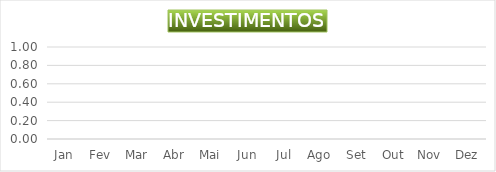
| Category | INVESTIMENTOS |
|---|---|
| Jan | 0 |
| Fev | 0 |
| Mar | 0 |
| Abr | 0 |
| Mai | 0 |
| Jun | 0 |
| Jul | 0 |
| Ago | 0 |
| Set | 0 |
| Out | 0 |
| Nov | 0 |
| Dez | 0 |